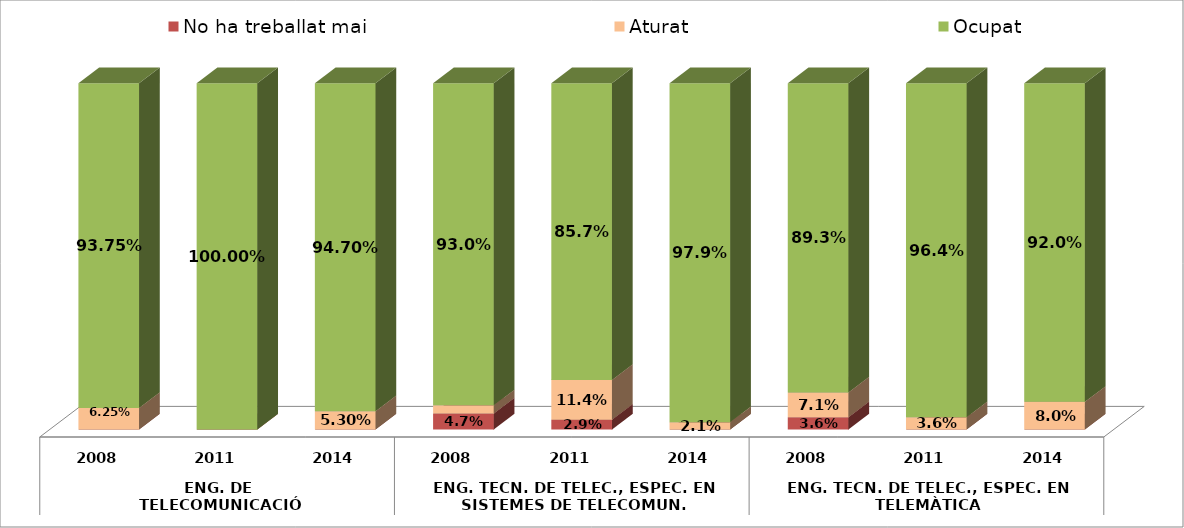
| Category | No ha treballat mai | Aturat | Ocupat |
|---|---|---|---|
| 0 | 0 | 0.062 | 0.938 |
| 1 | 0 | 0 | 1 |
| 2 | 0 | 0.053 | 0.947 |
| 3 | 0.046 | 0.023 | 0.93 |
| 4 | 0.029 | 0.114 | 0.857 |
| 5 | 0 | 0.021 | 0.979 |
| 6 | 0.036 | 0.071 | 0.893 |
| 7 | 0 | 0.036 | 0.964 |
| 8 | 0 | 0.08 | 0.92 |